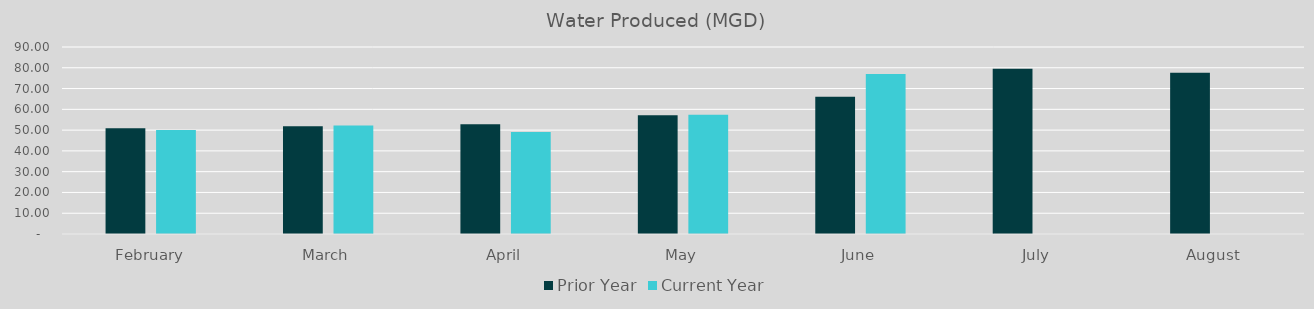
| Category | Prior Year | Current Year |
|---|---|---|
| February | 50.84 | 50.11 |
| March | 51.85 | 52.27 |
| April | 52.78 | 49.07 |
| May | 57.16 | 57.41 |
| June | 66.11 | 77.05 |
| July | 79.53 | 0 |
| August | 77.55 | 0 |